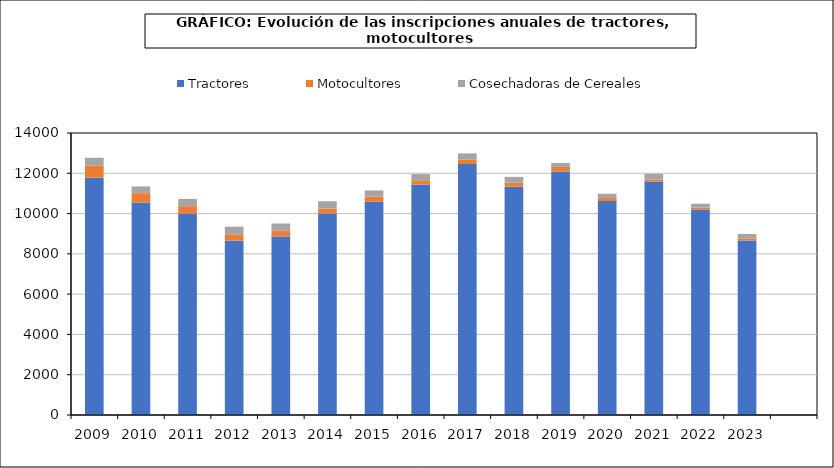
| Category | Tractores | Motocultores | Cosechadoras de Cereales |
|---|---|---|---|
| 2009.0 | 11784 | 603 | 384 |
| 2010.0 | 10548 | 463 | 336 |
| 2011.0 | 10002 | 366 | 362 |
| 2012.0 | 8655 | 315 | 380 |
| 2013.0 | 8859 | 287 | 361 |
| 2014.0 | 10004 | 248 | 360 |
| 2015.0 | 10587 | 257 | 305 |
| 2016.0 | 11449 | 209 | 302 |
| 2017.0 | 12457 | 231 | 301 |
| 2018.0 | 11333 | 204 | 284 |
| 2019.0 | 12087 | 228 | 200 |
| 2020.0 | 10620 | 150 | 215 |
| 2021.0 | 11593 | 105 | 273 |
| 2022.0 | 10200 | 101 | 190 |
| 2023.0 | 8667 | 104 | 217 |